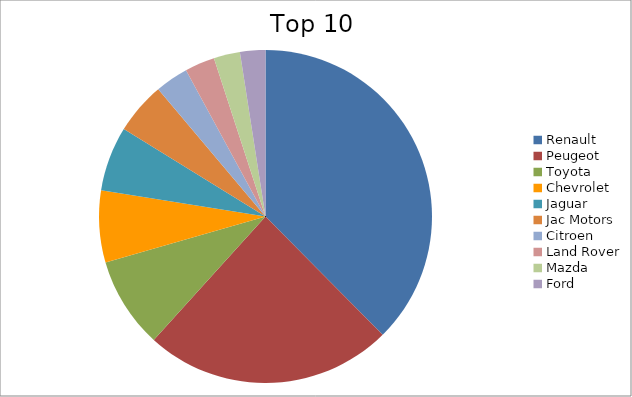
| Category | Series 0 |
|---|---|
| Renault | 37.58 |
| Peugeot | 24.13 |
| Toyota | 8.83 |
| Chevrolet | 6.98 |
| Jaguar | 6.28 |
| Jac Motors | 5.06 |
| Citroen | 3.22 |
| Land Rover | 2.91 |
| Mazda | 2.55 |
| Ford | 2.46 |